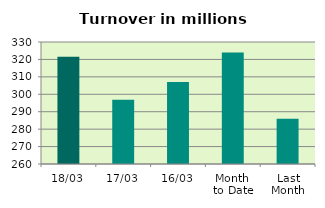
| Category | Series 0 |
|---|---|
| 18/03 | 321.481 |
| 17/03 | 296.875 |
| 16/03 | 306.984 |
| Month 
to Date | 324.016 |
| Last
Month | 285.972 |